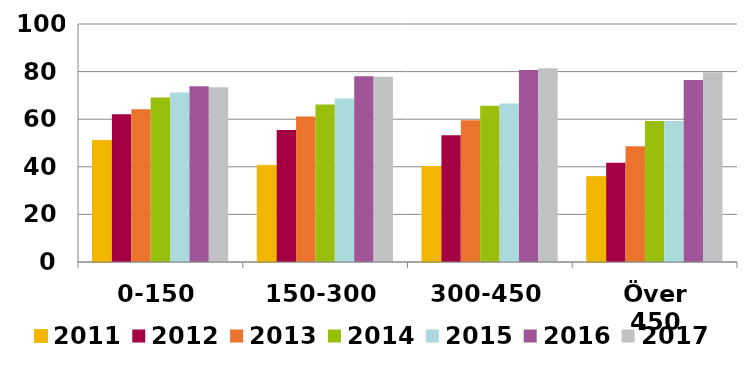
| Category | 2011 | 2012 | 2013 | 2014 | 2015 | 2016 | 2017 |
|---|---|---|---|---|---|---|---|
| 0-150 | 51.09 | 62.083 | 64.162 | 69.155 | 71.237 | 73.884 | 73.44 |
| 150-300 | 40.597 | 55.501 | 61.15 | 66.176 | 68.729 | 78.088 | 77.845 |
| 300-450 | 40.145 | 53.264 | 59.606 | 65.621 | 66.552 | 80.63 | 81.395 |
| Över 450 | 35.845 | 41.664 | 48.594 | 59.228 | 59.283 | 76.436 | 79.77 |